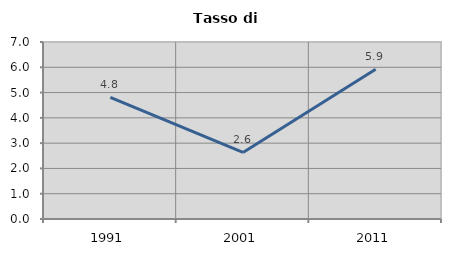
| Category | Tasso di disoccupazione   |
|---|---|
| 1991.0 | 4.815 |
| 2001.0 | 2.632 |
| 2011.0 | 5.926 |